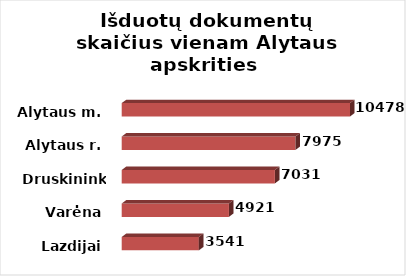
| Category | Series 0 |
|---|---|
| Lazdijai | 3541 |
| Varėna | 4921 |
| Druskininkai | 7031 |
| Alytaus r. | 7975 |
| Alytaus m. | 10478 |